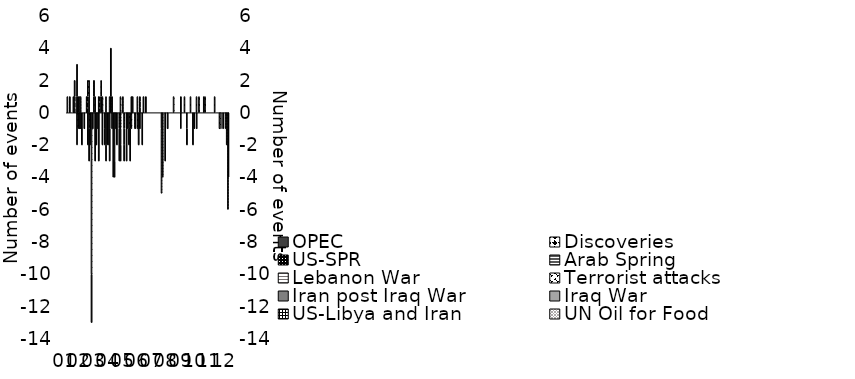
| Category | UN Oil for Food | US-Libya and Iran | Iraq War | Iran post Iraq War | Terrorist attacks | Lebanon War | Arab Spring | US-SPR | Discoveries | OPEC |
|---|---|---|---|---|---|---|---|---|---|---|
| 2001-01-01 | 1 | 0 | 0 | 0 | 0 | 0 | 0 | 0 | 0 | 0 |
| 2001-02-01 | 0 | 0 | 0 | 0 | 0 | 0 | 0 | 0 | 0 | 0 |
| 2001-03-01 | 0 | 0 | 0 | 0 | 0 | 0 | 0 | 0 | 0 | 1 |
| 2001-04-01 | 0 | 0 | 0 | 0 | 0 | 0 | 0 | 0 | 0 | 0 |
| 2001-05-01 | 0 | 0 | 0 | 0 | 0 | 0 | 0 | 0 | 0 | 0 |
| 2001-06-01 | 0 | 0 | 0 | 0 | 0 | 0 | 0 | 0 | 0 | 1 |
| 2001-07-01 | 0 | 0 | 0 | 0 | 0 | 0 | 0 | 0 | 1 | 1 |
| 2001-08-01 | 0 | 0 | 0 | 0 | 0 | 0 | 0 | 0 | 0 | 0 |
| 2001-09-01 | 0 | 0 | -2 | 0 | 0 | 0 | 0 | 1 | 0 | 2 |
| 2001-10-01 | 1 | 0 | 0 | 0 | -1 | 0 | 0 | 0 | 0 | 0 |
| 2001-11-01 | 1 | 0 | 0 | 0 | 0 | 0 | 0 | 0 | 0 | -1 |
| 2001-12-01 | 1 | 0 | 0 | 0 | 0 | 0 | 0 | 0 | 0 | -1 |
| 2002-01-01 | 0 | 0 | 0 | 0 | 0 | 0 | 0 | 0 | 0 | -2 |
| 2002-02-01 | 0 | 0 | 0 | 0 | 0 | 0 | 0 | 0 | 0 | 0 |
| 2002-03-01 | 0 | 0 | 0 | 0 | 0 | 0 | 0 | 0 | 0 | -1 |
| 2002-04-01 | 0 | 0 | 0 | 0 | 0 | 0 | 0 | 0 | 0 | 0 |
| 2002-05-01 | 0 | 0 | 0 | 0 | 0 | 0 | 0 | 0 | 1 | 0 |
| 2002-06-01 | 1 | 0 | 0 | 0 | 0 | 0 | 0 | 0 | 1 | -2 |
| 2002-07-01 | 2 | 0 | 0 | 0 | -1 | 0 | 0 | 0 | 0 | -2 |
| 2002-08-01 | 0 | -1 | -1 | 0 | 0 | 0 | 0 | 0 | 0 | 0 |
| 2002-09-01 | 0 | 0 | 0 | 0 | -10 | 0 | 0 | 0 | 0 | -3 |
| 2002-10-01 | 0 | 0 | 0 | 0 | 0 | 0 | 0 | 0 | 0 | -1 |
| 2002-11-01 | 1 | 0 | 0 | 0 | 0 | 0 | 0 | 1 | 0 | 0 |
| 2002-12-01 | 0 | 0 | 0 | 0 | 0 | 0 | 0 | 0 | 1 | -3 |
| 2003-01-01 | 0 | 0 | -1 | 0 | 0 | 0 | 0 | 0 | 0 | -1 |
| 2003-02-01 | 0 | 0 | -1 | 0 | 0 | 0 | 0 | 0 | 0 | 0 |
| 2003-03-01 | 0 | 0 | 0 | 0 | 0 | 0 | 0 | 0 | 1 | -3 |
| 2003-04-01 | 1 | 0 | 0 | 0 | 0 | 0 | 0 | 0 | 0 | 0 |
| 2003-05-01 | 1 | 0 | 0 | 0 | 0 | 0 | 0 | 0 | 1 | 0 |
| 2003-06-01 | 0 | 0 | 0 | 0 | 0 | 0 | 0 | 0 | 1 | -2 |
| 2003-07-01 | 0 | 0 | 0 | 0 | 0 | 0 | 0 | 0 | 0 | 0 |
| 2003-08-01 | 0 | 0 | -1 | 0 | 0 | 0 | 0 | 0 | 0 | -1 |
| 2003-09-01 | 1 | 0 | -2 | 0 | 0 | 0 | 0 | 0 | 0 | -1 |
| 2003-10-01 | 0 | 0 | -2 | 0 | 0 | 0 | 0 | 0 | 0 | 0 |
| 2003-11-01 | 0 | 0 | -2 | 0 | 0 | 0 | 0 | 0 | 0 | 0 |
| 2003-12-01 | 1 | 0 | -1 | 0 | 0 | 0 | 0 | 0 | 0 | -2 |
| 2004-01-01 | 0 | 0 | 0 | 0 | 0 | 0 | 0 | 1 | 0 | 3 |
| 2004-02-01 | 0 | 0 | -1 | 0 | 0 | 0 | 0 | 0 | 0 | 1 |
| 2004-03-01 | 0 | 0 | -4 | 0 | 0 | 0 | 0 | 0 | 0 | 0 |
| 2004-04-01 | 0 | 0 | -3 | 0 | 0 | 0 | 0 | 0 | 0 | -1 |
| 2004-05-01 | 0 | 0 | -1 | 0 | 0 | 0 | 0 | 0 | 0 | 0 |
| 2004-06-01 | 0 | 0 | 0 | 0 | 0 | 0 | 0 | 0 | 0 | -2 |
| 2004-07-01 | 0 | 0 | 0 | 0 | 0 | 0 | 0 | 0 | 0 | 0 |
| 2004-08-01 | 0 | -1 | -2 | 0 | 0 | 0 | 0 | 0 | 0 | 0 |
| 2004-09-01 | 0 | -1 | -1 | 0 | 0 | 0 | 0 | 0 | 1 | -1 |
| 2004-10-01 | 0 | 0 | 0 | 0 | 0 | 0 | 0 | 0 | 0 | 0 |
| 2004-11-01 | 1 | 0 | 0 | 0 | 0 | 0 | 0 | 0 | 0 | 0 |
| 2004-12-01 | 0 | -1 | -1 | 0 | 0 | 0 | 0 | 0 | 0 | -1 |
| 2005-01-01 | 0 | 0 | 0 | 0 | 0 | 0 | 0 | 0 | 0 | 0 |
| 2005-02-01 | 0 | -1 | 0 | 0 | 0 | 0 | 0 | 0 | 0 | -2 |
| 2005-03-01 | 0 | 0 | 0 | 0 | 0 | 0 | 0 | 0 | 0 | -1 |
| 2005-04-01 | 0 | 0 | 0 | 0 | -1 | 0 | 0 | 0 | 0 | -1 |
| 2005-05-01 | 0 | 0 | 0 | 0 | -1 | 0 | 0 | 0 | 0 | -2 |
| 2005-06-01 | 0 | 0 | 0 | 0 | -1 | 0 | 0 | 0 | 0 | 1 |
| 2005-07-01 | 0 | 0 | 0 | 0 | 0 | 0 | 0 | 0 | 0 | 1 |
| 2005-08-01 | 0 | 0 | 0 | 0 | 0 | 0 | 0 | 0 | 0 | 0 |
| 2005-09-01 | 0 | -1 | 0 | 0 | 0 | 0 | 0 | 0 | 0 | 0 |
| 2005-10-01 | 0 | 0 | 0 | 0 | 0 | 0 | 0 | 0 | 0 | 0 |
| 2005-11-01 | 1 | 0 | 0 | 0 | -1 | 0 | 0 | 0 | 0 | 0 |
| 2005-12-01 | 0 | 0 | 0 | 0 | 0 | 0 | 0 | 0 | 0 | -2 |
| 2006-01-01 | 0 | 0 | 0 | 0 | 0 | 0 | 0 | 0 | 1 | -1 |
| 2006-02-01 | 0 | 0 | 0 | 0 | 0 | 0 | 0 | 0 | 0 | 0 |
| 2006-03-01 | 0 | 0 | 0 | 0 | 0 | 0 | 0 | 0 | 0 | -2 |
| 2006-04-01 | 0 | 0 | 0 | 0 | 0 | 0 | 0 | 0 | 0 | 1 |
| 2006-05-01 | 0 | 0 | 0 | 0 | 0 | 0 | 0 | 0 | 0 | 0 |
| 2006-06-01 | 0 | 0 | 0 | 0 | 0 | 0 | 0 | 0 | 0 | 1 |
| 2006-07-01 | 0 | 0 | 0 | 0 | 0 | 0 | 0 | 0 | 0 | 0 |
| 2006-08-01 | 0 | 0 | 0 | 0 | 0 | 0 | 0 | 0 | 0 | 0 |
| 2006-09-01 | 0 | 0 | 0 | 0 | 0 | 0 | 0 | 0 | 0 | 0 |
| 2006-10-01 | 0 | 0 | 0 | 0 | 0 | 0 | 0 | 0 | 0 | 0 |
| 2006-11-01 | 0 | 0 | 0 | 0 | 0 | 0 | 0 | 0 | 0 | 0 |
| 2006-12-01 | 0 | 0 | 0 | 0 | 0 | 0 | 0 | 0 | 0 | 0 |
| 2007-01-01 | 0 | 0 | 0 | 0 | 0 | 0 | 0 | 0 | 0 | 0 |
| 2007-02-01 | 0 | 0 | 0 | 0 | 0 | 0 | 0 | 0 | 0 | 0 |
| 2007-03-01 | 0 | 0 | 0 | 0 | 0 | 0 | 0 | 0 | 0 | 0 |
| 2007-04-01 | 0 | 0 | 0 | 0 | 0 | 0 | 0 | 0 | 0 | 0 |
| 2007-05-01 | 0 | 0 | 0 | 0 | 0 | 0 | 0 | 0 | 0 | 0 |
| 2007-06-01 | 0 | 0 | 0 | 0 | 0 | 0 | 0 | 0 | 0 | 0 |
| 2007-07-01 | 0 | 0 | 0 | -1 | 0 | -4 | 0 | 0 | 0 | 0 |
| 2007-08-01 | 0 | 0 | 0 | 0 | 0 | -4 | 0 | 0 | 0 | 0 |
| 2007-09-01 | 0 | 0 | 0 | 0 | 0 | 0 | 0 | 0 | 0 | 0 |
| 2007-10-01 | 0 | 0 | 0 | 0 | 0 | 0 | 0 | 0 | 0 | -3 |
| 2007-11-01 | 0 | 0 | 0 | 0 | 0 | 0 | 0 | 0 | 0 | 0 |
| 2007-12-01 | 0 | 0 | 0 | 0 | 0 | 0 | 0 | 0 | 0 | -1 |
| 2008-01-01 | 0 | 0 | 0 | 0 | 0 | 0 | 0 | 0 | 0 | 0 |
| 2008-02-01 | 0 | 0 | 0 | 0 | 0 | 0 | 0 | 0 | 0 | 0 |
| 2008-03-01 | 0 | 0 | 0 | 0 | 0 | 0 | 0 | 0 | 0 | 0 |
| 2008-04-01 | 0 | 0 | 0 | 0 | 0 | 0 | 0 | 0 | 0 | 0 |
| 2008-05-01 | 0 | 0 | 0 | 0 | 0 | 0 | 0 | 0 | 1 | 0 |
| 2008-06-01 | 0 | 0 | 0 | 0 | 0 | 0 | 0 | 0 | 0 | 0 |
| 2008-07-01 | 0 | 0 | 0 | 0 | 0 | 0 | 0 | 0 | 0 | 0 |
| 2008-08-01 | 0 | 0 | 0 | 0 | 0 | 0 | 0 | 0 | 0 | 0 |
| 2008-09-01 | 0 | 0 | 0 | 0 | 0 | 0 | 0 | 0 | 0 | 0 |
| 2008-10-01 | 0 | 0 | 0 | 0 | 0 | 0 | 0 | 0 | 0 | 0 |
| 2008-11-01 | 0 | 0 | 0 | 0 | -1 | 0 | 0 | 0 | 0 | 1 |
| 2008-12-01 | 0 | 0 | 0 | 0 | 0 | 0 | 0 | 0 | 0 | 0 |
| 2009-01-01 | 0 | 0 | 0 | 0 | 0 | 0 | 0 | 0 | 0 | 0 |
| 2009-02-01 | 0 | 0 | 0 | 0 | 0 | 0 | 0 | 0 | 1 | 0 |
| 2009-03-01 | 0 | 0 | 0 | 0 | 0 | 0 | 0 | 0 | 0 | 0 |
| 2009-04-01 | 0 | 0 | 0 | 0 | -1 | 0 | 0 | 0 | 0 | -1 |
| 2009-05-01 | 0 | 0 | 0 | 0 | 0 | 0 | 0 | 0 | 0 | 0 |
| 2009-06-01 | 0 | 0 | 0 | 0 | 0 | 0 | 0 | 0 | 0 | 0 |
| 2009-07-01 | 0 | 0 | 0 | 0 | 0 | 0 | 0 | 0 | 1 | 0 |
| 2009-08-01 | 0 | 0 | 0 | 0 | 0 | 0 | 0 | 0 | 0 | 0 |
| 2009-09-01 | 0 | 0 | 0 | 0 | 0 | 0 | 0 | 0 | 0 | -2 |
| 2009-10-01 | 0 | 0 | 0 | 0 | 0 | 0 | 0 | 0 | 0 | -1 |
| 2009-11-01 | 0 | 0 | 0 | 0 | 0 | 0 | 0 | 0 | 0 | 0 |
| 2009-12-01 | 0 | 0 | 0 | 0 | 0 | 0 | 0 | 0 | 1 | -1 |
| 2010-01-01 | 0 | 0 | 0 | 0 | 0 | 0 | 0 | 0 | 0 | 0 |
| 2010-02-01 | 0 | 0 | 0 | 0 | 0 | 0 | 0 | 0 | 1 | 0 |
| 2010-03-01 | 0 | 0 | 0 | 0 | 0 | 0 | 0 | 0 | 0 | 0 |
| 2010-04-01 | 0 | 0 | 0 | 0 | 0 | 0 | 0 | 0 | 0 | 0 |
| 2010-05-01 | 0 | 0 | 0 | 0 | 0 | 0 | 0 | 0 | 0 | 0 |
| 2010-06-01 | 0 | 0 | 0 | 0 | 0 | 0 | 0 | 0 | 1 | 0 |
| 2010-07-01 | 0 | 0 | 0 | 0 | 0 | 0 | 0 | 0 | 1 | 0 |
| 2010-08-01 | 0 | 0 | 0 | 0 | 0 | 0 | 0 | 0 | 0 | 0 |
| 2010-09-01 | 0 | 0 | 0 | 0 | 0 | 0 | 0 | 0 | 0 | 0 |
| 2010-10-01 | 0 | 0 | 0 | 0 | 0 | 0 | 0 | 0 | 0 | 0 |
| 2010-11-01 | 0 | 0 | 0 | 0 | 0 | 0 | 0 | 0 | 0 | 0 |
| 2010-12-01 | 0 | 0 | 0 | 0 | 0 | 0 | 0 | 0 | 0 | 0 |
| 2011-01-01 | 0 | 0 | 0 | 0 | 0 | 0 | 0 | 0 | 0 | 0 |
| 2011-02-01 | 0 | 0 | 0 | 0 | 0 | 0 | 0 | 0 | 0 | 0 |
| 2011-03-01 | 0 | 0 | 0 | 0 | 0 | 0 | 0 | 0 | 1 | 0 |
| 2011-04-01 | 0 | 0 | 0 | 0 | 0 | 0 | 0 | 0 | 0 | 0 |
| 2011-05-01 | 0 | 0 | 0 | 0 | 0 | 0 | 0 | 0 | 0 | 0 |
| 2011-06-01 | 0 | 0 | 0 | 0 | 0 | 0 | 0 | 0 | 0 | 0 |
| 2011-07-01 | 0 | 0 | 0 | 0 | -1 | 0 | 0 | 0 | 0 | 0 |
| 2011-08-01 | 0 | 0 | 0 | -1 | 0 | 0 | 0 | 0 | 0 | 0 |
| 2011-09-01 | 0 | 0 | 0 | 0 | 0 | 0 | 0 | 0 | 0 | 0 |
| 2011-10-01 | 0 | 0 | 0 | -1 | 0 | 0 | 0 | 0 | 0 | 0 |
| 2011-11-01 | 0 | 0 | 0 | 0 | 0 | 0 | 0 | 0 | 0 | 0 |
| 2011-12-01 | 0 | 0 | 0 | 0 | 0 | 0 | -1 | 0 | 0 | 0 |
| 2012-01-01 | 0 | 0 | 0 | 0 | 0 | 0 | -2 | 0 | 0 | 0 |
| 2012-02-01 | 0 | 0 | 0 | 0 | 0 | 0 | -6 | 0 | 0 | 0 |
| 2012-03-01 | 0 | 0 | 0 | 0 | 0 | 0 | -4 | 0 | 0 | 0 |